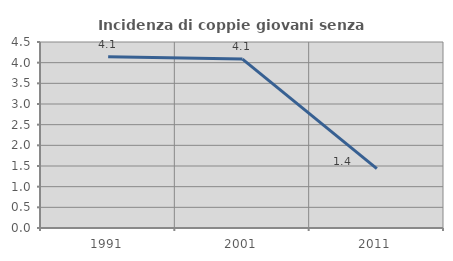
| Category | Incidenza di coppie giovani senza figli |
|---|---|
| 1991.0 | 4.141 |
| 2001.0 | 4.086 |
| 2011.0 | 1.436 |